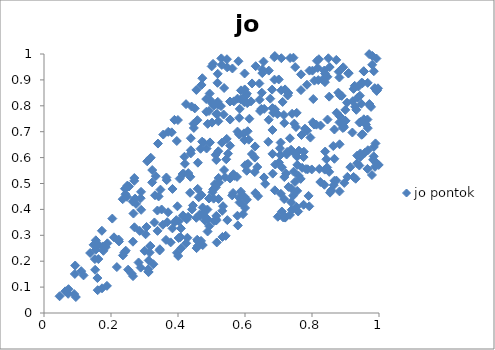
| Category | jo pontok |
|---|---|
| 0.689054311287923 | 0.474 |
| 0.4931675768872681 | 0.335 |
| 0.5984831092451843 | 0.449 |
| -1.0 | 0 |
| 0.9242182161739443 | 0.525 |
| 0.43829098426990587 | 0.675 |
| 0.9205547910805401 | 0.697 |
| 0.24396306707823356 | 0.241 |
| -1.0 | 0 |
| -1.0 | 0 |
| -1.0 | 0 |
| 0.5872574843647005 | 0.825 |
| 0.6066282559233178 | 0.81 |
| 0.930330596321068 | 0.518 |
| 0.8726686779024799 | 0.511 |
| -1.0 | 0 |
| -1.0 | 0 |
| -1.0 | 0 |
| 0.3892433965037858 | 0.746 |
| 0.2897184477868491 | 0.468 |
| 0.5987861929339626 | 0.925 |
| -1.0 | 0 |
| 0.3153493514466712 | 0.233 |
| 0.7043539331855524 | 0.636 |
| 0.6809008553586011 | 0.862 |
| 0.6178445153413459 | 0.817 |
| -1.0 | 0 |
| 0.42442373580826054 | 0.269 |
| 0.7704024008479795 | 0.56 |
| -1.0 | 0 |
| -1.0 | 0 |
| -1.0 | 0 |
| 0.5293815896800176 | 0.983 |
| 0.5135729941223313 | 0.362 |
| -1.0 | 0 |
| 0.4945537806948561 | 0.847 |
| 0.689660159337562 | 0.786 |
| 0.9084356576273445 | 0.925 |
| -1.0 | 0 |
| -1.0 | 0 |
| -1.0 | 0 |
| 0.6390821563341929 | 0.451 |
| -1.0 | 0 |
| -1.0 | 0 |
| 0.7008092111170869 | 0.902 |
| 0.7082564188699481 | 0.86 |
| 0.2885693161992542 | 0.175 |
| -1.0 | 0 |
| 0.7472983988434825 | 0.618 |
| 0.5142348415563931 | 0.591 |
| 0.6965395628699635 | 0.768 |
| -1.0 | 0 |
| 0.784987347563374 | 0.881 |
| 0.4019319576018656 | 0.29 |
| -1.0 | 0 |
| -1.0 | 0 |
| 0.6553656632476061 | 0.971 |
| -1.0 | 0 |
| -1.0 | 0 |
| 0.22279152986196005 | 0.284 |
| -1.0 | 0 |
| -1.0 | 0 |
| 0.5178889547033818 | 0.889 |
| 0.9932229940635797 | 0.858 |
| -1.0 | 0 |
| -1.0 | 0 |
| 0.872501914012481 | 0.977 |
| 0.8832872112720462 | 0.759 |
| 0.5306999314719687 | 0.958 |
| -1.0 | 0 |
| -1.0 | 0 |
| -1.0 | 0 |
| -1.0 | 0 |
| 0.5026815654384689 | 0.466 |
| -1.0 | 0 |
| -1.0 | 0 |
| 0.3126257876586769 | 0.203 |
| -1.0 | 0 |
| 0.8735955226629517 | 0.773 |
| -1.0 | 0 |
| 0.7210629007505522 | 0.37 |
| -1.0 | 0 |
| 0.4573858178101118 | 0.283 |
| -1.0 | 0 |
| 0.26959623829436197 | 0.521 |
| -1.0 | 0 |
| -1.0 | 0 |
| -1.0 | 0 |
| -1.0 | 0 |
| 0.9365672457790613 | 0.832 |
| -1.0 | 0 |
| -1.0 | 0 |
| 0.438160002086444 | 0.616 |
| -1.0 | 0 |
| 0.3113337939241716 | 0.159 |
| 0.7918171690473401 | 0.412 |
| 0.9721576338878806 | 0.802 |
| -1.0 | 0 |
| 0.8071818907784225 | 0.897 |
| 0.3963803790107834 | 0.664 |
| 0.8887833965119596 | 0.838 |
| -1.0 | 0 |
| -1.0 | 0 |
| -1.0 | 0 |
| 0.3458548626055302 | 0.246 |
| 0.9413045593355986 | 0.569 |
| 0.5147408585699811 | 0.768 |
| 0.7071084227843194 | 0.46 |
| -1.0 | 0 |
| -1.0 | 0 |
| 0.3228001545543926 | 0.504 |
| 0.8386086443173169 | 0.891 |
| -1.0 | 0 |
| 0.621085771715713 | 0.886 |
| 0.6291315007170537 | 0.6 |
| -1.0 | 0 |
| 0.6515906011501134 | 0.926 |
| 0.938643803548322 | 0.874 |
| -1.0 | 0 |
| 0.96658107232203 | 0.714 |
| 0.9323155951783983 | 0.784 |
| 0.0920482772832747 | 0.151 |
| -1.0 | 0 |
| 0.5376143858598379 | 0.869 |
| 0.3385673297209093 | 0.396 |
| -1.0 | 0 |
| -1.0 | 0 |
| 0.5827014265502575 | 0.753 |
| 0.5688215163349151 | 0.529 |
| -1.0 | 0 |
| 0.8428726231342054 | 0.594 |
| 0.30323216130931785 | 0.304 |
| 0.5991538831366752 | 0.863 |
| -1.0 | 0 |
| 0.07320576523106759 | 0.092 |
| 0.35599949740939785 | 0.689 |
| 0.5616976618542227 | 0.454 |
| -1.0 | 0 |
| 0.5047164278933531 | 0.962 |
| -1.0 | 0 |
| 0.9547260671844158 | 0.933 |
| -1.0 | 0 |
| -1.0 | 0 |
| -1.0 | 0 |
| -1.0 | 0 |
| -1.0 | 0 |
| 0.42803614753847485 | 0.291 |
| 0.2693610579845924 | 0.51 |
| 0.6711185089556702 | 0.936 |
| 0.4702558228046063 | 0.456 |
| 0.5343483890060998 | 0.412 |
| -1.0 | 0 |
| -1.0 | 0 |
| -1.0 | 0 |
| 0.9824373987961188 | 0.592 |
| 0.81872048332958 | 0.899 |
| -1.0 | 0 |
| 0.31241074948682157 | 0.158 |
| -1.0 | 0 |
| 0.8393132685558617 | 0.623 |
| 0.488676358041527 | 0.73 |
| -1.0 | 0 |
| -1.0 | 0 |
| 0.1892950691116877 | 0.269 |
| -1.0 | 0 |
| -1.0 | 0 |
| 0.43011289162510136 | 0.371 |
| -1.0 | 0 |
| 0.17283285914485402 | 0.317 |
| -1.0 | 0 |
| -1.0 | 0 |
| 0.7200547373393926 | 0.368 |
| 0.8013141819263845 | 0.936 |
| 0.6450053300049827 | 0.78 |
| -1.0 | 0 |
| -1.0 | 0 |
| 0.16218935209395813 | 0.208 |
| -1.0 | 0 |
| -1.0 | 0 |
| 0.8840610417997568 | 0.84 |
| -1.0 | 0 |
| 0.4501863952786218 | 0.79 |
| -1.0 | 0 |
| -1.0 | 0 |
| 0.48285098400662463 | 0.369 |
| 0.9578737276645795 | 0.619 |
| 0.6302063219838303 | 0.643 |
| -1.0 | 0 |
| 0.3780629497127359 | 0.273 |
| 0.8955875464035437 | 0.717 |
| 0.6573161998185457 | 0.788 |
| -1.0 | 0 |
| -1.0 | 0 |
| -1.0 | 0 |
| 0.582436110917496 | 0.691 |
| 0.8038148955870317 | 0.826 |
| 0.11118351362845758 | 0.162 |
| -1.0 | 0 |
| 0.6089126231751854 | 0.576 |
| -1.0 | 0 |
| -1.0 | 0 |
| -1.0 | 0 |
| 0.7819185256344312 | 0.556 |
| 0.7686102843689382 | 0.687 |
| 0.9094462462559916 | 0.926 |
| 0.605654022399797 | 0.847 |
| -1.0 | 0 |
| 0.3903141540523576 | 0.351 |
| -1.0 | 0 |
| 0.4720219291418193 | 0.662 |
| 0.414762552306164 | 0.377 |
| -1.0 | 0 |
| -1.0 | 0 |
| -1.0 | 0 |
| 0.2670245139632357 | 0.384 |
| 0.6517051502328912 | 0.94 |
| 0.3001541546451163 | 0.24 |
| -1.0 | 0 |
| 0.5667419824881625 | 0.817 |
| -1.0 | 0 |
| 0.9444247149423828 | 0.616 |
| -1.0 | 0 |
| -1.0 | 0 |
| -1.0 | 0 |
| -1.0 | 0 |
| 0.5143266354673426 | 0.375 |
| -1.0 | 0 |
| -1.0 | 0 |
| -1.0 | 0 |
| 0.22398064659355832 | 0.276 |
| 0.4926138451877238 | 0.78 |
| -1.0 | 0 |
| -1.0 | 0 |
| 0.5492240038083835 | 0.615 |
| 0.705611261122221 | 0.61 |
| -1.0 | 0 |
| 0.5204080573416532 | 0.625 |
| 0.6206608652981362 | 0.614 |
| 0.4702948758466192 | 0.881 |
| -1.0 | 0 |
| 0.35493861588841735 | 0.341 |
| -1.0 | 0 |
| -1.0 | 0 |
| 0.43604645700384936 | 0.464 |
| 0.3297021514765781 | 0.35 |
| -1.0 | 0 |
| 0.5015294917142077 | 0.735 |
| 0.8204835399268822 | 0.98 |
| 0.5461679171651186 | 0.98 |
| 0.32654522329963775 | 0.188 |
| -1.0 | 0 |
| -1.0 | 0 |
| 0.5004702398629481 | 0.952 |
| 0.7242099209818589 | 0.612 |
| 0.40874130909738504 | 0.327 |
| 0.515764701191687 | 0.272 |
| 0.978992426365225 | 0.533 |
| -1.0 | 0 |
| -1.0 | 0 |
| -1.0 | 0 |
| 0.4587258184210281 | 0.479 |
| 0.16220110699183365 | 0.264 |
| 0.7553995462052481 | 0.603 |
| -1.0 | 0 |
| -1.0 | 0 |
| 0.3314184411386427 | 0.455 |
| 0.7293269615375719 | 0.85 |
| 0.8389207396515159 | 0.925 |
| 0.8576371736787043 | 0.474 |
| 0.9654998619398132 | 0.556 |
| -1.0 | 0 |
| 0.4472810977350621 | 0.715 |
| -1.0 | 0 |
| -1.0 | 0 |
| 0.34214013826875433 | 0.45 |
| -1.0 | 0 |
| -1.0 | 0 |
| -1.0 | 0 |
| 0.7535781331258802 | 0.41 |
| -1.0 | 0 |
| -1.0 | 0 |
| 0.2432423304439193 | 0.459 |
| -1.0 | 0 |
| -1.0 | 0 |
| -1.0 | 0 |
| 0.36542850738416366 | 0.523 |
| -1.0 | 0 |
| -1.0 | 0 |
| 0.8932011501374086 | 0.949 |
| 0.5554281589132863 | 0.646 |
| -1.0 | 0 |
| -1.0 | 0 |
| -1.0 | 0 |
| -1.0 | 0 |
| -1.0 | 0 |
| 0.3401913550951181 | 0.654 |
| -1.0 | 0 |
| -1.0 | 0 |
| 0.8669214212350278 | 0.708 |
| -1.0 | 0 |
| 0.9430568217952313 | 0.839 |
| -1.0 | 0 |
| -1.0 | 0 |
| 0.4954531840547671 | 0.659 |
| 0.9473456495277492 | 0.808 |
| 0.4579372071516836 | 0.744 |
| 0.6057669941286836 | 0.437 |
| 0.2719741991800355 | 0.442 |
| 0.7856187521332916 | 0.704 |
| -1.0 | 0 |
| -1.0 | 0 |
| -1.0 | 0 |
| 0.7587114786097127 | 0.392 |
| -1.0 | 0 |
| 0.44457490638625075 | 0.415 |
| -1.0 | 0 |
| 0.9510109308595842 | 0.887 |
| -1.0 | 0 |
| 0.5924425115292511 | 0.42 |
| 0.8312240502266581 | 0.901 |
| 0.7558276215152278 | 0.471 |
| 0.2479648356619304 | 0.448 |
| -1.0 | 0 |
| -1.0 | 0 |
| -1.0 | 0 |
| 0.58266418631964 | 0.446 |
| -1.0 | 0 |
| -1.0 | 0 |
| -1.0 | 0 |
| 0.8147546818968456 | 0.974 |
| 0.8822289940174426 | 0.469 |
| -1.0 | 0 |
| 0.43073431350857083 | 0.54 |
| -1.0 | 0 |
| -1.0 | 0 |
| 0.8370932367339943 | 0.495 |
| 0.7160060047796177 | 0.765 |
| 0.587914762226208 | 0.86 |
| -1.0 | 0 |
| -1.0 | 0 |
| 0.6755443695294236 | 0.828 |
| -1.0 | 0 |
| -1.0 | 0 |
| -1.0 | 0 |
| 0.4164882483096908 | 0.538 |
| -1.0 | 0 |
| -1.0 | 0 |
| -1.0 | 0 |
| 0.7275230241803274 | 0.84 |
| -1.0 | 0 |
| 0.7472013066207515 | 0.731 |
| -1.0 | 0 |
| 0.545424433321946 | 0.672 |
| 0.7608767113706598 | 0.627 |
| -1.0 | 0 |
| 0.8254980163268393 | 0.724 |
| -1.0 | 0 |
| -1.0 | 0 |
| 0.6111666712729855 | 0.669 |
| 0.9934233515688966 | 0.858 |
| 0.44052357500668027 | 0.797 |
| 0.5189360536735628 | 0.815 |
| -1.0 | 0 |
| -1.0 | 0 |
| 0.9288116887389695 | 0.796 |
| -1.0 | 0 |
| -1.0 | 0 |
| 0.5326825884173791 | 0.294 |
| 0.7993376492444959 | 0.554 |
| 0.555598264246326 | 0.747 |
| 0.9347866326629835 | 0.578 |
| 0.15194816849074133 | 0.208 |
| 0.3475793721140734 | 0.476 |
| -1.0 | 0 |
| -1.0 | 0 |
| -1.0 | 0 |
| 0.13777789830053333 | 0.232 |
| 0.7123947041312961 | 0.815 |
| 0.7672268249764314 | 0.921 |
| 0.547248450160648 | 0.359 |
| -1.0 | 0 |
| -1.0 | 0 |
| 0.454681602561382 | 0.368 |
| 0.488330910690584 | 0.315 |
| -1.0 | 0 |
| 0.8668735567018833 | 0.511 |
| -1.0 | 0 |
| -1.0 | 0 |
| -1.0 | 0 |
| -1.0 | 0 |
| -1.0 | 0 |
| -1.0 | 0 |
| -1.0 | 0 |
| -1.0 | 0 |
| 0.18427549805094423 | 0.254 |
| -1.0 | 0 |
| -1.0 | 0 |
| 0.5552348368597491 | 0.817 |
| 0.4074377809358767 | 0.293 |
| 0.7446697504717452 | 0.986 |
| 0.36769946121375696 | 0.351 |
| -1.0 | 0 |
| 0.9796900499900882 | 0.958 |
| -1.0 | 0 |
| -1.0 | 0 |
| -1.0 | 0 |
| 0.5779080868280664 | 0.828 |
| -1.0 | 0 |
| -1.0 | 0 |
| -1.0 | 0 |
| -1.0 | 0 |
| -1.0 | 0 |
| 0.8528312935442857 | 0.95 |
| 0.5320397481537258 | 0.395 |
| 0.5361929753128063 | 0.766 |
| -1.0 | 0 |
| -1.0 | 0 |
| 0.39980526008890305 | 0.745 |
| -1.0 | 0 |
| -1.0 | 0 |
| 0.5311609495690603 | 0.658 |
| -1.0 | 0 |
| -1.0 | 0 |
| 0.7405348562251419 | 0.769 |
| 0.308069195703393 | 0.586 |
| 0.4672782968157505 | 0.634 |
| -1.0 | 0 |
| 0.4049295874424945 | 0.519 |
| -1.0 | 0 |
| 0.5554035853550365 | 0.519 |
| 0.15470776632243144 | 0.281 |
| 0.8130243147310436 | 0.727 |
| 0.38110432227060453 | 0.697 |
| -1.0 | 0 |
| -1.0 | 0 |
| -1.0 | 0 |
| -1.0 | 0 |
| -1.0 | 0 |
| -1.0 | 0 |
| -1.0 | 0 |
| 0.11808420962860033 | 0.145 |
| -1.0 | 0 |
| -1.0 | 0 |
| 0.5874447010887156 | 0.469 |
| -1.0 | 0 |
| 0.514166545409612 | 0.357 |
| -1.0 | 0 |
| 0.851382429044441 | 0.545 |
| -1.0 | 0 |
| 0.5654015568448454 | 0.536 |
| 0.9800409145578044 | 0.993 |
| -1.0 | 0 |
| -1.0 | 0 |
| -1.0 | 0 |
| -1.0 | 0 |
| -1.0 | 0 |
| 0.8464082168133065 | 0.747 |
| -1.0 | 0 |
| -1.0 | 0 |
| 0.5439695883346154 | 0.593 |
| 0.2885429877508745 | 0.443 |
| 0.07205809056844625 | 0.074 |
| -1.0 | 0 |
| -1.0 | 0 |
| -1.0 | 0 |
| 0.47372685826566485 | 0.407 |
| -1.0 | 0 |
| -1.0 | 0 |
| 0.8538371506331566 | 0.465 |
| 0.5186889361613523 | 0.923 |
| -1.0 | 0 |
| 0.9240543278776556 | 0.865 |
| -1.0 | 0 |
| 0.7493824270835487 | 0.506 |
| -1.0 | 0 |
| 0.9480109768867013 | 0.688 |
| -1.0 | 0 |
| 0.7173265558083743 | 0.525 |
| 0.5230555871921352 | 0.504 |
| -1.0 | 0 |
| -1.0 | 0 |
| 0.4687558757524908 | 0.278 |
| -1.0 | 0 |
| -1.0 | 0 |
| -1.0 | 0 |
| 0.7748740657707816 | 0.418 |
| -1.0 | 0 |
| 0.34528665445582085 | 0.241 |
| -1.0 | 0 |
| -1.0 | 0 |
| -1.0 | 0 |
| 0.8452654570051514 | 0.562 |
| -1.0 | 0 |
| -1.0 | 0 |
| -1.0 | 0 |
| 0.2174455519502967 | 0.177 |
| -1.0 | 0 |
| 0.4463283727614149 | 0.731 |
| 0.5969586319876212 | 0.694 |
| -1.0 | 0 |
| 0.9444638907974598 | 0.737 |
| -1.0 | 0 |
| 0.9762896001345744 | 0.796 |
| -1.0 | 0 |
| -1.0 | 0 |
| 0.5170058887698694 | 0.768 |
| 0.28563396421050946 | 0.317 |
| -1.0 | 0 |
| 0.47390806545122754 | 0.262 |
| 0.3708504949391882 | 0.699 |
| -1.0 | 0 |
| 0.9873124382082745 | 0.868 |
| 0.6979246439960005 | 0.372 |
| -1.0 | 0 |
| -1.0 | 0 |
| 0.9845258462417386 | 0.934 |
| -1.0 | 0 |
| 0.7377091296609422 | 0.428 |
| 0.31859846280609694 | 0.6 |
| -1.0 | 0 |
| 0.502037025337728 | 0.809 |
| -1.0 | 0 |
| 0.5281830840788642 | 0.799 |
| -1.0 | 0 |
| 0.09318105833008339 | 0.183 |
| -1.0 | 0 |
| 0.8995010795730671 | 0.784 |
| -1.0 | 0 |
| 0.046509455067904604 | 0.065 |
| 0.7389259755820883 | 0.48 |
| -1.0 | 0 |
| -1.0 | 0 |
| -1.0 | 0 |
| -1.0 | 0 |
| -1.0 | 0 |
| -1.0 | 0 |
| 0.505027656723132 | 0.477 |
| 0.7065123694708473 | 0.658 |
| 0.4878285521132517 | 0.4 |
| -1.0 | 0 |
| -1.0 | 0 |
| -1.0 | 0 |
| -1.0 | 0 |
| -1.0 | 0 |
| -1.0 | 0 |
| -1.0 | 0 |
| -1.0 | 0 |
| 0.33890494365571033 | 0.317 |
| -1.0 | 0 |
| -1.0 | 0 |
| 0.6435126003878517 | 0.824 |
| 0.7341454032770749 | 0.675 |
| -1.0 | 0 |
| 0.546803652296366 | 0.948 |
| 0.670868422600509 | 0.746 |
| 0.17319105329331208 | 0.095 |
| -1.0 | 0 |
| 0.7173157789462357 | 0.733 |
| 0.5644516597395333 | 0.463 |
| 0.15945008013470208 | 0.135 |
| 0.15271938846206012 | 0.167 |
| -1.0 | 0 |
| -1.0 | 0 |
| -1.0 | 0 |
| 0.9544414439020175 | 0.934 |
| -1.0 | 0 |
| 0.409693916559025 | 0.25 |
| 0.4662167705325724 | 0.375 |
| -1.0 | 0 |
| 0.5943142767647043 | 0.382 |
| 0.7522675257833145 | 0.718 |
| -1.0 | 0 |
| 0.17575561669116624 | 0.257 |
| 0.5837944232693664 | 0.427 |
| -1.0 | 0 |
| -1.0 | 0 |
| 0.754394334176963 | 0.773 |
| -1.0 | 0 |
| -1.0 | 0 |
| -1.0 | 0 |
| 0.36419471513082113 | 0.282 |
| 0.24165821287675993 | 0.48 |
| 0.6003842881023087 | 0.57 |
| -1.0 | 0 |
| -1.0 | 0 |
| -1.0 | 0 |
| 0.9969455891502097 | 0.868 |
| -1.0 | 0 |
| 0.6695344640397751 | 0.661 |
| 0.3177535902069595 | 0.259 |
| -1.0 | 0 |
| -1.0 | 0 |
| 0.29002335859365624 | 0.398 |
| 0.584359323455856 | 0.788 |
| -1.0 | 0 |
| -1.0 | 0 |
| -1.0 | 0 |
| -1.0 | 0 |
| -1.0 | 0 |
| -1.0 | 0 |
| -1.0 | 0 |
| -1.0 | 0 |
| -1.0 | 0 |
| -1.0 | 0 |
| -1.0 | 0 |
| -1.0 | 0 |
| -1.0 | 0 |
| -1.0 | 0 |
| -1.0 | 0 |
| -1.0 | 0 |
| 0.8797162997650005 | 0.932 |
| 0.7374070615028112 | 0.63 |
| 0.7084548690642647 | 0.984 |
| 0.16025100466265307 | 0.088 |
| -1.0 | 0 |
| -1.0 | 0 |
| 0.4417907806338919 | 0.4 |
| 0.40265202614329976 | 0.355 |
| -1.0 | 0 |
| -1.0 | 0 |
| -1.0 | 0 |
| -1.0 | 0 |
| 0.26578630005780957 | 0.142 |
| 0.9991631275057473 | 0.572 |
| -1.0 | 0 |
| 0.8023122333149768 | 0.736 |
| 0.3061426501260518 | 0.332 |
| -1.0 | 0 |
| -1.0 | 0 |
| 0.3336193848336748 | 0.528 |
| -1.0 | 0 |
| -1.0 | 0 |
| 0.5123065821197574 | 0.611 |
| -1.0 | 0 |
| 0.40062515742046845 | 0.22 |
| 0.9547969443661977 | 0.748 |
| -1.0 | 0 |
| 0.687512165028699 | 0.987 |
| 0.7604499035636665 | 0.529 |
| -1.0 | 0 |
| 0.9610364712807131 | 0.728 |
| -1.0 | 0 |
| -1.0 | 0 |
| -1.0 | 0 |
| 0.17730104927699952 | 0.24 |
| -1.0 | 0 |
| 0.5980771518106129 | 0.814 |
| -1.0 | 0 |
| -1.0 | 0 |
| 0.7670549626269472 | 0.861 |
| -1.0 | 0 |
| 0.8247669431797942 | 0.506 |
| -1.0 | 0 |
| -1.0 | 0 |
| -1.0 | 0 |
| -1.0 | 0 |
| -1.0 | 0 |
| 0.6051674978389017 | 0.549 |
| -1.0 | 0 |
| 0.3833831456189818 | 0.327 |
| -1.0 | 0 |
| -1.0 | 0 |
| -1.0 | 0 |
| -1.0 | 0 |
| -1.0 | 0 |
| 0.8381428619205826 | 0.554 |
| -1.0 | 0 |
| -1.0 | 0 |
| -1.0 | 0 |
| -1.0 | 0 |
| 0.6903162129327063 | 0.573 |
| -1.0 | 0 |
| -1.0 | 0 |
| 0.3110975775708851 | 0.169 |
| 0.8786944259932536 | 0.851 |
| -1.0 | 0 |
| -1.0 | 0 |
| -1.0 | 0 |
| -1.0 | 0 |
| -1.0 | 0 |
| -1.0 | 0 |
| -1.0 | 0 |
| 0.41392208436416844 | 0.537 |
| -1.0 | 0 |
| 0.2537421549732368 | 0.488 |
| -1.0 | 0 |
| -1.0 | 0 |
| -1.0 | 0 |
| 0.47261938451492114 | 0.906 |
| 0.3703657032379102 | 0.389 |
| 0.6002629817365162 | 0.406 |
| 0.578626476076491 | 0.338 |
| 0.4591354668933234 | 0.259 |
| 0.23558229789503216 | 0.222 |
| -1.0 | 0 |
| -1.0 | 0 |
| -1.0 | 0 |
| 0.866879097499341 | 0.595 |
| 0.8937389425405697 | 0.722 |
| -1.0 | 0 |
| 0.15502989702630732 | 0.245 |
| 0.23492601931710055 | 0.439 |
| 0.8649517643090938 | 0.493 |
| -1.0 | 0 |
| -1.0 | 0 |
| -1.0 | 0 |
| 0.5625320873840112 | 0.944 |
| 0.7756933127931278 | 0.623 |
| -1.0 | 0 |
| 0.2748872527687105 | 0.421 |
| 0.6130850061979398 | 0.75 |
| -1.0 | 0 |
| 0.845980267570952 | 0.912 |
| -1.0 | 0 |
| -1.0 | 0 |
| 0.8488550843532503 | 0.983 |
| 0.7258992652204146 | 0.622 |
| -1.0 | 0 |
| -1.0 | 0 |
| 0.4640761692908566 | 0.38 |
| 0.6021104309990939 | 0.838 |
| -1.0 | 0 |
| 0.6820349705705899 | 0.791 |
| -1.0 | 0 |
| -1.0 | 0 |
| -1.0 | 0 |
| 0.7169760086875039 | 0.44 |
| -1.0 | 0 |
| 0.26502034096106564 | 0.43 |
| -1.0 | 0 |
| -1.0 | 0 |
| -1.0 | 0 |
| 0.7227936023717778 | 0.539 |
| -1.0 | 0 |
| 0.39698765817503867 | 0.232 |
| -1.0 | 0 |
| 0.7452399190015422 | 0.546 |
| -1.0 | 0 |
| -1.0 | 0 |
| -1.0 | 0 |
| -1.0 | 0 |
| 0.6828207892640219 | 0.538 |
| 0.6307214651896393 | 0.463 |
| 0.650230740727991 | 0.85 |
| -1.0 | 0 |
| 0.36618960912004583 | 0.513 |
| 0.5064297151339754 | 0.442 |
| 0.5804528974131009 | 0.972 |
| 0.4618900832828712 | 0.447 |
| 0.24892548815010906 | 0.492 |
| -1.0 | 0 |
| 0.9844931237975447 | 0.641 |
| -1.0 | 0 |
| 0.5405261219544579 | 0.524 |
| -1.0 | 0 |
| -1.0 | 0 |
| -1.0 | 0 |
| -1.0 | 0 |
| 0.681905215420672 | 0.707 |
| -1.0 | 0 |
| -1.0 | 0 |
| -1.0 | 0 |
| -1.0 | 0 |
| -1.0 | 0 |
| 0.882357284451933 | 0.651 |
| 0.6821532671453259 | 0.615 |
| -1.0 | 0 |
| -1.0 | 0 |
| 0.42590406571350226 | 0.362 |
| 0.49250255086479555 | 0.442 |
| -1.0 | 0 |
| 0.7897561340824657 | 0.452 |
| 0.9144486302360093 | 0.563 |
| -1.0 | 0 |
| -1.0 | 0 |
| 0.7100865644666936 | 0.392 |
| -1.0 | 0 |
| 0.9348970631835853 | 0.608 |
| -1.0 | 0 |
| 0.7013942233097188 | 0.581 |
| -1.0 | 0 |
| 0.5100545077048706 | 0.498 |
| 0.2510344104172848 | 0.167 |
| 0.6080464008171234 | 0.702 |
| 0.45554962315497005 | 0.251 |
| -1.0 | 0 |
| -1.0 | 0 |
| 0.5423355129230052 | 0.298 |
| 0.39830010447249564 | 0.412 |
| -1.0 | 0 |
| 0.9481921667443349 | 0.889 |
| 0.7394414290901559 | 0.398 |
| 0.43839959939283957 | 0.628 |
| 0.09018090117814381 | 0.073 |
| 0.3949331534777283 | 0.359 |
| -1.0 | 0 |
| -1.0 | 0 |
| 0.7749061501462784 | 0.602 |
| 0.7952519310201043 | 0.677 |
| 0.7300751793353983 | 0.487 |
| 0.710408091855744 | 0.562 |
| -1.0 | 0 |
| -1.0 | 0 |
| -1.0 | 0 |
| 0.5761707552117548 | 0.525 |
| -1.0 | 0 |
| 0.8172766145064667 | 0.946 |
| -1.0 | 0 |
| 0.9046580468380307 | 0.812 |
| -1.0 | 0 |
| -1.0 | 0 |
| 0.7346673390425216 | 0.984 |
| -1.0 | 0 |
| 0.8989004123198066 | 0.743 |
| -1.0 | 0 |
| 0.47632589900758737 | 0.388 |
| 0.4852860786876576 | 0.635 |
| 0.68900911429232 | 0.992 |
| -1.0 | 0 |
| 0.684272432942234 | 0.772 |
| 0.7561182726196671 | 0.572 |
| 0.1480815084328777 | 0.263 |
| 0.966253134349863 | 0.889 |
| -1.0 | 0 |
| 0.2699763150382086 | 0.331 |
| -1.0 | 0 |
| -1.0 | 0 |
| -1.0 | 0 |
| 0.4762010625170314 | 0.658 |
| -1.0 | 0 |
| -1.0 | 0 |
| 0.7662030780178108 | 0.518 |
| 0.5774665608312841 | 0.375 |
| -1.0 | 0 |
| 0.41937009057762165 | 0.603 |
| 0.5835667824383419 | 0.689 |
| -1.0 | 0 |
| 0.4881033256628575 | 0.362 |
| 0.787017868695538 | 0.555 |
| -1.0 | 0 |
| -1.0 | 0 |
| -1.0 | 0 |
| -1.0 | 0 |
| 0.7434611847529573 | 0.453 |
| -1.0 | 0 |
| -1.0 | 0 |
| -1.0 | 0 |
| -1.0 | 0 |
| 0.5776379402289225 | 0.7 |
| -1.0 | 0 |
| 0.905586787046925 | 0.526 |
| 0.2617462323572264 | 0.152 |
| -1.0 | 0 |
| -1.0 | 0 |
| -1.0 | 0 |
| -1.0 | 0 |
| -1.0 | 0 |
| -1.0 | 0 |
| -1.0 | 0 |
| 0.6567694445600374 | 0.523 |
| -1.0 | 0 |
| 0.9911667318259838 | 0.58 |
| 0.8217099895031428 | 0.556 |
| 0.5073095160119983 | 0.8 |
| 0.4206927861644134 | 0.576 |
| 0.9418193533526513 | 0.735 |
| -1.0 | 0 |
| -1.0 | 0 |
| 0.85139579287054 | 0.835 |
| 0.7142253943753136 | 0.369 |
| 0.9218301256450996 | 0.818 |
| -1.0 | 0 |
| 0.6366542531694332 | 0.564 |
| 0.20393584593605407 | 0.365 |
| 0.7342164204972046 | 0.379 |
| -1.0 | 0 |
| 0.8963934213061049 | 0.502 |
| -1.0 | 0 |
| 0.9669184418519501 | 0.629 |
| 0.9923422414752343 | 0.983 |
| -1.0 | 0 |
| -1.0 | 0 |
| -1.0 | 0 |
| 0.9509133115867172 | 0.69 |
| 0.8059267506494865 | 0.728 |
| -1.0 | 0 |
| 0.4847556947931748 | 0.777 |
| 0.4811545257402461 | 0.356 |
| 0.6487239716381392 | 0.788 |
| 0.8818344363931958 | 0.909 |
| 0.42398056700048503 | 0.806 |
| -1.0 | 0 |
| 0.5129604964019796 | 0.485 |
| -1.0 | 0 |
| -1.0 | 0 |
| -1.0 | 0 |
| 0.6428864179599576 | 0.886 |
| -1.0 | 0 |
| -1.0 | 0 |
| -1.0 | 0 |
| -1.0 | 0 |
| -1.0 | 0 |
| -1.0 | 0 |
| -1.0 | 0 |
| -1.0 | 0 |
| -1.0 | 0 |
| 0.48426025147719454 | 0.826 |
| -1.0 | 0 |
| -1.0 | 0 |
| 0.45873562989221206 | 0.278 |
| 0.9002370356987299 | 0.742 |
| 0.6602412029879379 | 0.499 |
| -1.0 | 0 |
| -1.0 | 0 |
| 0.8820208282089022 | 0.736 |
| 0.2655194686034168 | 0.275 |
| -1.0 | 0 |
| -1.0 | 0 |
| -1.0 | 0 |
| -1.0 | 0 |
| 0.454713085157211 | 0.861 |
| 0.965536471857531 | 0.747 |
| 0.18778987996979635 | 0.105 |
| 0.5203440204466654 | 0.74 |
| -1.0 | 0 |
| -1.0 | 0 |
| -1.0 | 0 |
| 0.4367695165079324 | 0.526 |
| 0.282300966137893 | 0.195 |
| 0.5083015692969912 | 0.356 |
| 0.9879415237882343 | 0.564 |
| -1.0 | 0 |
| -1.0 | 0 |
| 0.9895299099258317 | 0.655 |
| 0.6318633621571816 | 0.953 |
| -1.0 | 0 |
| -1.0 | 0 |
| 0.7789665680364151 | 0.712 |
| 0.8364150160263288 | 0.936 |
| 0.3165721136366031 | 0.258 |
| -1.0 | 0 |
| -1.0 | 0 |
| -1.0 | 0 |
| -1.0 | 0 |
| 0.3230730225226912 | 0.552 |
| 0.2398113812555851 | 0.234 |
| 0.35114077296067325 | 0.4 |
| 0.5194000507422505 | 0.803 |
| 0.6292423317119751 | 0.544 |
| 0.9841114103647304 | 0.605 |
| -1.0 | 0 |
| 0.49684569909446274 | 0.821 |
| -1.0 | 0 |
| 0.7196782766489935 | 0.863 |
| 0.5213342416321751 | 0.522 |
| -1.0 | 0 |
| 0.2510768524993552 | 0.489 |
| 0.38354817702599675 | 0.479 |
| -1.0 | 0 |
| -1.0 | 0 |
| -1.0 | 0 |
| -1.0 | 0 |
| 0.06338122466474094 | 0.084 |
| 0.749770010644023 | 0.949 |
| 0.5985458071799274 | 0.667 |
| 0.9705509968872645 | 1 |
| 0.20887308186696973 | 0.292 |
| 0.8635150722467577 | 0.645 |
| -1.0 | 0 |
| 0.5208574810900934 | 0.44 |
| 0.6067245803150909 | 0.574 |
| 0.45937651726841633 | 0.58 |
| -1.0 | 0 |
| 0.6880283360328336 | 0.901 |
| 0.9712808369469361 | 0.807 |
| -1.0 | 0 |
| -1.0 | 0 |
| -1.0 | 0 |
| 0.892098033369749 | 0.714 |
| 0.7924554479723991 | 0.936 |
| -1.0 | 0 |
| -1.0 | 0 |
| -1.0 | 0 |
| 0.09501237478998092 | 0.062 |
| -1.0 | 0 |
| -1.0 | 0 |
| -1.0 | 0 |
| -1.0 | 0 |
| -1.0 | 0 |
| 0.9274620904346556 | 0.877 |
| -1.0 | 0 |
| -1.0 | 0 |
| -1.0 | 0 |
| -1.0 | 0 |
| -1.0 | 0 |
| 0.9446577119214332 | 0.603 |
| -1.0 | 0 |
| -1.0 | 0 |
| -1.0 | 0 |
| 0.5374475335419198 | 0.552 |